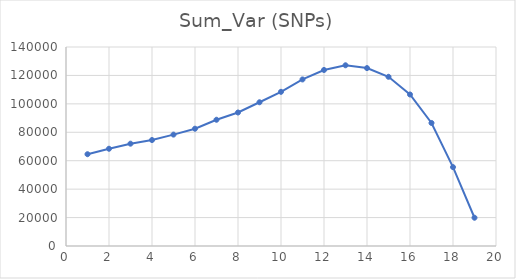
| Category | Series 0 |
|---|---|
| 0 | 64576 |
| 1 | 68421 |
| 2 | 71987 |
| 3 | 74548 |
| 4 | 78371 |
| 5 | 82519 |
| 6 | 88818 |
| 7 | 93923 |
| 8 | 101115 |
| 9 | 108472 |
| 10 | 117178 |
| 11 | 123839 |
| 12 | 127140 |
| 13 | 125162 |
| 14 | 119040 |
| 15 | 106585 |
| 16 | 86552 |
| 17 | 55494 |
| 18 | 19883 |